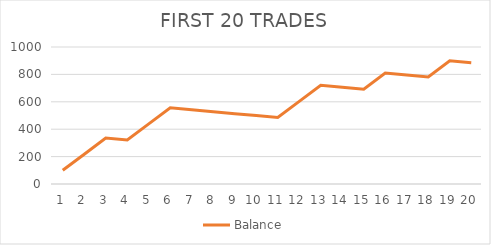
| Category | Balance |
|---|---|
| 0 | 100 |
| 1 | 217.56 |
| 2 | 335.12 |
| 3 | 320.96 |
| 4 | 438.52 |
| 5 | 556.08 |
| 6 | 541.92 |
| 7 | 527.76 |
| 8 | 513.6 |
| 9 | 499.44 |
| 10 | 485.28 |
| 11 | 602.84 |
| 12 | 720.4 |
| 13 | 706.24 |
| 14 | 692.08 |
| 15 | 809.64 |
| 16 | 795.48 |
| 17 | 781.32 |
| 18 | 898.88 |
| 19 | 884.72 |